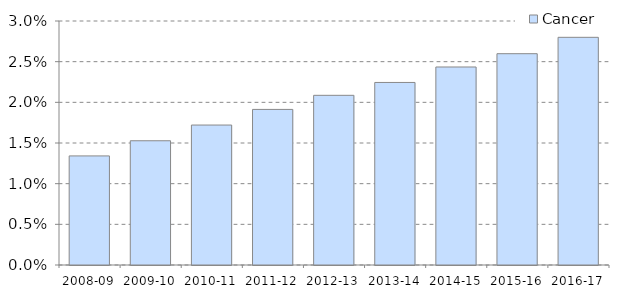
| Category | Cancer |
|---|---|
| 2008-09 | 0.013 |
| 2009-10 | 0.015 |
| 2010-11 | 0.017 |
| 2011-12 | 0.019 |
| 2012-13 | 0.021 |
| 2013-14 | 0.022 |
| 2014-15 | 0.024 |
| 2015-16 | 0.026 |
| 2016-17 | 0.028 |